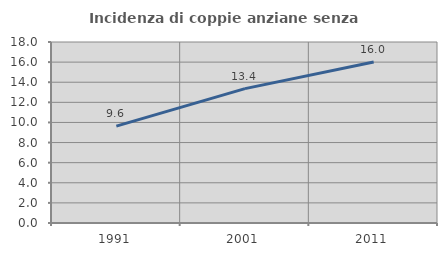
| Category | Incidenza di coppie anziane senza figli  |
|---|---|
| 1991.0 | 9.637 |
| 2001.0 | 13.362 |
| 2011.0 | 16.011 |